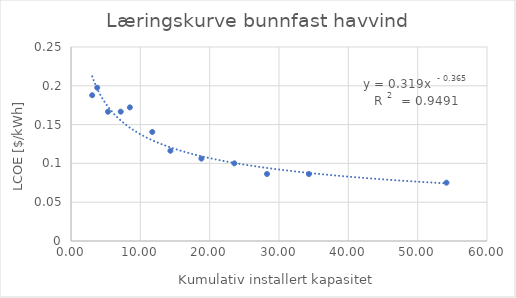
| Category | LCOE offshore vind [$/kWh] |
|---|---|
| 3.056 | 0.188 |
| 3.78 | 0.198 |
| 5.33 | 0.167 |
| 7.171 | 0.167 |
| 8.492 | 0.172 |
| 11.72 | 0.141 |
| 14.34 | 0.116 |
| 18.81 | 0.106 |
| 23.56 | 0.1 |
| 28.27 | 0.086 |
| 34.316 | 0.086 |
| 54.154 | 0.075 |